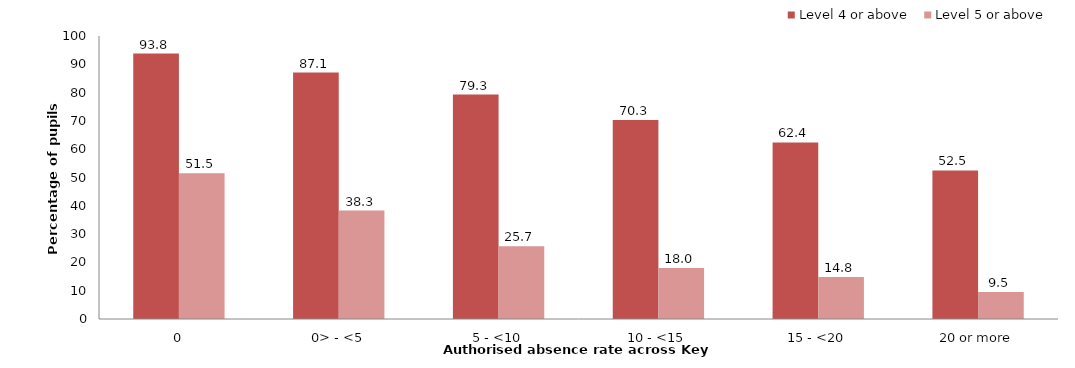
| Category | Level 4 or above | Level 5 or above |
|---|---|---|
| 0 | 93.8 | 51.5 |
| 0> - <5 | 87.1 | 38.3 |
| 5 - <10 | 79.3 | 25.7 |
| 10 - <15 | 70.3 | 18 |
| 15 - <20 | 62.4 | 14.8 |
| 20 or more | 52.5 | 9.5 |